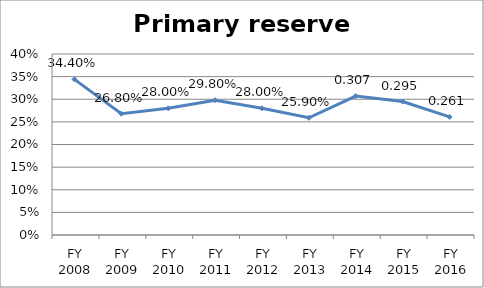
| Category | Primary reserve ratio |
|---|---|
| FY 2016 | 0.261 |
| FY 2015 | 0.295 |
| FY 2014 | 0.307 |
| FY 2013 | 0.259 |
| FY 2012 | 0.28 |
| FY 2011 | 0.298 |
| FY 2010 | 0.28 |
| FY 2009 | 0.268 |
| FY 2008 | 0.344 |